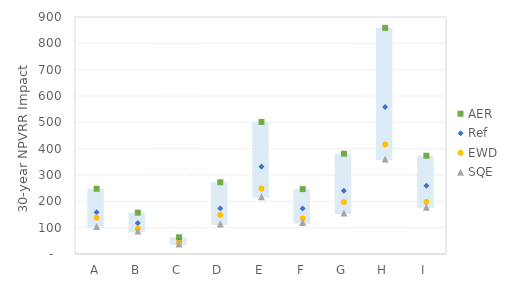
| Category | Min | Range |
|---|---|---|
| A | 104.71 | 143.132 |
| B | 86.929 | 70.154 |
| C | 37.954 | 25.665 |
| D | 113.963 | 158.468 |
| E | 217.087 | 284.498 |
| F | 119.862 | 126.609 |
| G | 155.238 | 225.724 |
| H | 360.36 | 498.543 |
| I | 177.685 | 195.568 |